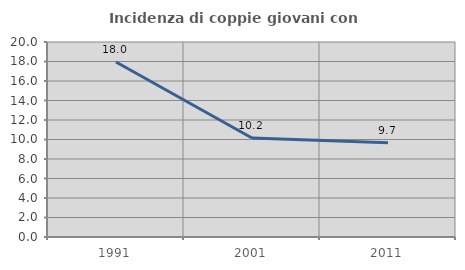
| Category | Incidenza di coppie giovani con figli |
|---|---|
| 1991.0 | 17.952 |
| 2001.0 | 10.159 |
| 2011.0 | 9.675 |